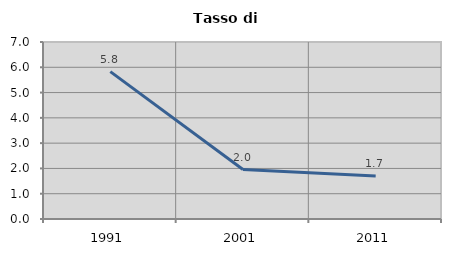
| Category | Tasso di disoccupazione   |
|---|---|
| 1991.0 | 5.828 |
| 2001.0 | 1.956 |
| 2011.0 | 1.697 |